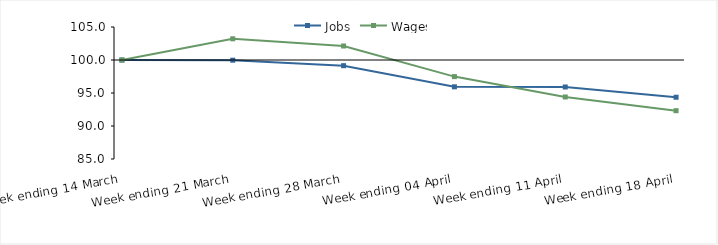
| Category | Jobs | Wages |
|---|---|---|
| 0 | 100 | 100 |
| 1900-01-01 | 99.971 | 103.215 |
| 1900-01-02 | 99.138 | 102.123 |
| 1900-01-03 | 95.937 | 97.484 |
| 1900-01-04 | 95.911 | 94.397 |
| 1900-01-05 | 94.358 | 92.319 |